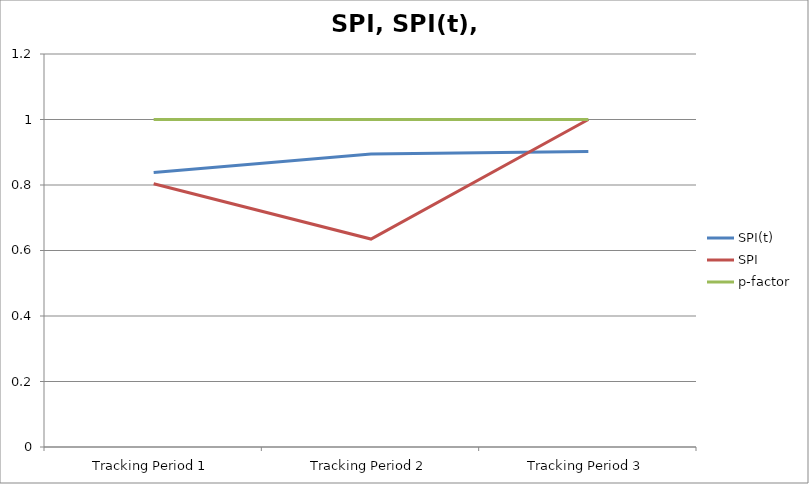
| Category | SPI(t) | SPI | p-factor |
|---|---|---|---|
| Tracking Period 1 | 0.838 | 0.804 | 1 |
| Tracking Period 2 | 0.895 | 0.635 | 1 |
| Tracking Period 3 | 0.902 | 1 | 1 |